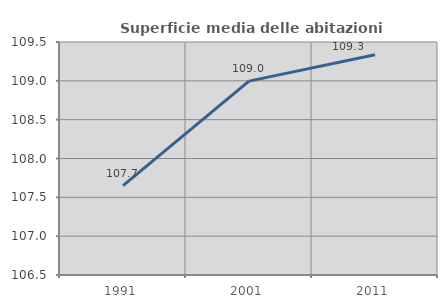
| Category | Superficie media delle abitazioni occupate |
|---|---|
| 1991.0 | 107.651 |
| 2001.0 | 108.996 |
| 2011.0 | 109.336 |